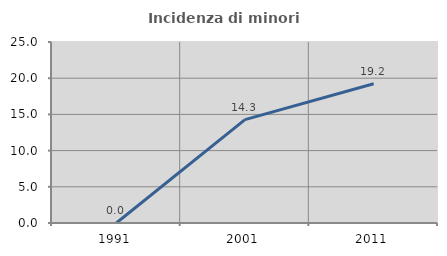
| Category | Incidenza di minori stranieri |
|---|---|
| 1991.0 | 0 |
| 2001.0 | 14.286 |
| 2011.0 | 19.231 |